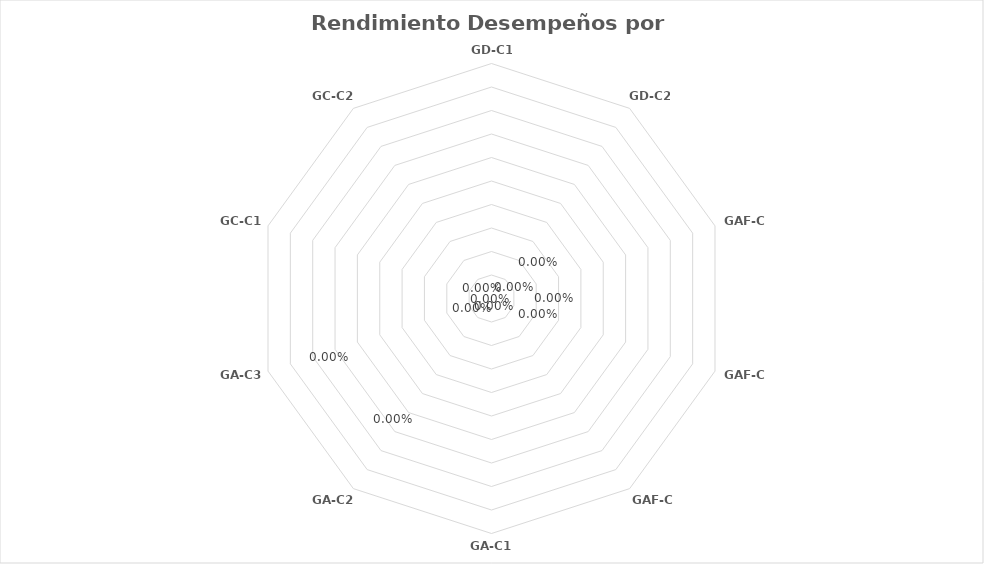
| Category | Series 0 |
|---|---|
| GD-C1 | 0 |
| GD-C2 | 0 |
| GAF-C1 | 0 |
| GAF-C2 | 0 |
| GAF-C3 | 0 |
| GA-C1 | 0 |
| GA-C2 | 0 |
| GA-C3 | 0 |
| GC-C1 | 0 |
| GC-C2 | 0 |